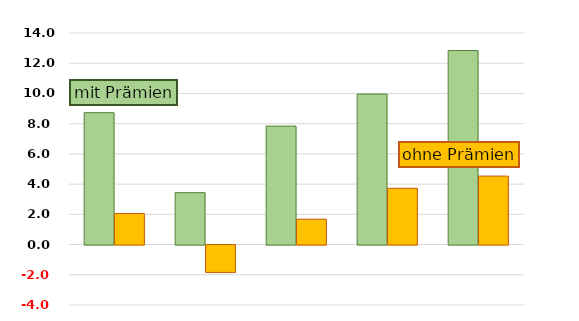
| Category | Stundenlohn 5 Jahre | Stundenlohn nach Änderung |
|---|---|---|
| BY Ø 52 K | 8.727 | 2.054 |
| 18 Kühe | 3.436 | -1.811 |
| 39 Kühe | 7.84 | 1.681 |
| 60 Kühe | 9.961 | 3.724 |
| 94 Kühe | 12.84 | 4.531 |